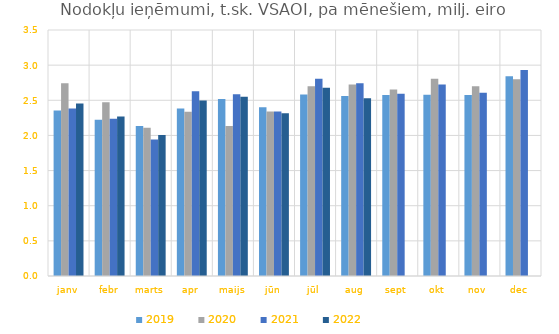
| Category | 2019 | 2020 | 2021 | 2022 |
|---|---|---|---|---|
| janv | 2.356 | 2.744 | 2.382 | 2.455 |
| febr | 2.224 | 2.471 | 2.236 | 2.27 |
| marts | 2.135 | 2.11 | 1.941 | 2.005 |
| apr | 2.385 | 2.336 | 2.63 | 2.497 |
| maijs | 2.517 | 2.132 | 2.587 | 2.551 |
| jūn | 2.4 | 2.34 | 2.339 | 2.317 |
| jūl | 2.582 | 2.7 | 2.806 | 2.678 |
| aug | 2.562 | 2.724 | 2.743 | 2.528 |
| sept | 2.574 | 2.654 | 2.595 | 0 |
| okt | 2.579 | 2.805 | 2.726 | 0 |
| nov | 2.576 | 2.701 | 2.606 | 0 |
| dec | 2.842 | 2.801 | 2.93 | 0 |